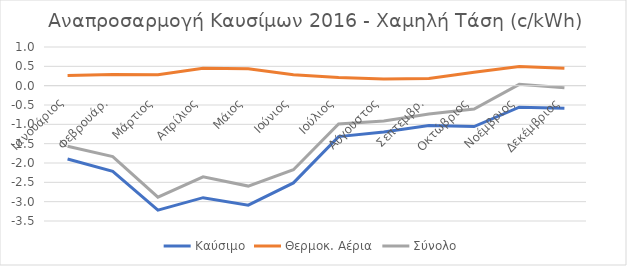
| Category | Καύσιμο | Θερμοκ. Αέρια | Σύνολο |
|---|---|---|---|
| Ιανουάριος | -1.898 | 0.265 | -1.569 |
| Φεβρουάρ. | -2.216 | 0.291 | -1.835 |
| Μάρτιος | -3.221 | 0.28 | -2.885 |
| Απρίλιος | -2.897 | 0.449 | -2.359 |
| Μάιος | -3.09 | 0.435 | -2.597 |
| Ιούνιος | -2.515 | 0.284 | -2.175 |
| Ιούλιος | -1.317 | 0.212 | -0.989 |
| Αύγουστος | -1.196 | 0.174 | -0.914 |
| Σεπτεμβρ. | -1.028 | 0.188 | -0.731 |
| Οκτώβριος | -1.058 | 0.349 | -0.604 |
| Νοέμβριος | -0.556 | 0.498 | 0.034 |
| Δεκέμβριος | -0.583 | 0.451 | -0.057 |